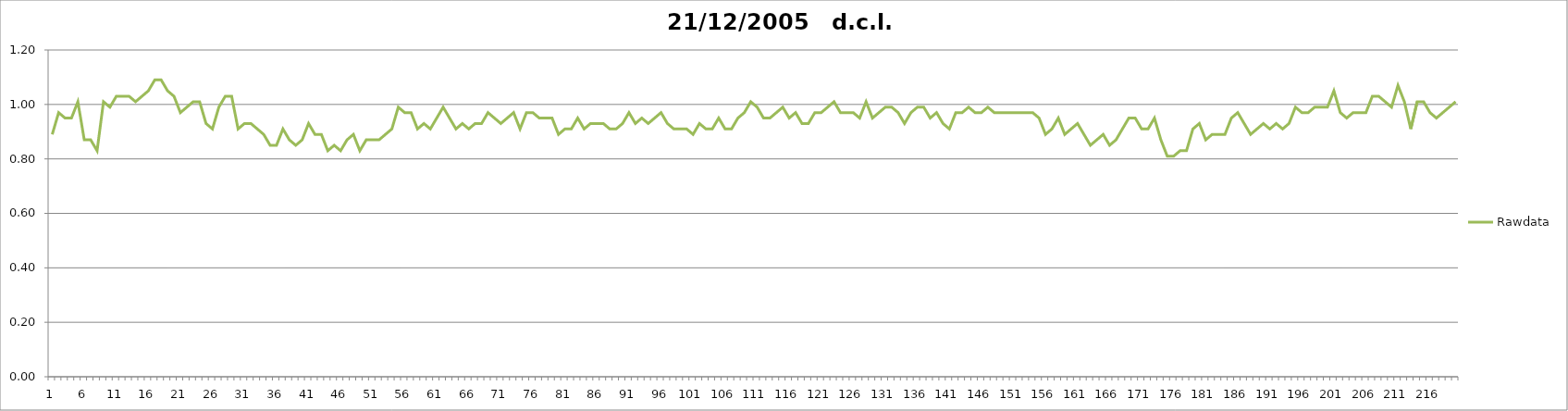
| Category | Rawdata |
|---|---|
| 0 | 0.89 |
| 1 | 0.97 |
| 2 | 0.95 |
| 3 | 0.95 |
| 4 | 1.01 |
| 5 | 0.87 |
| 6 | 0.87 |
| 7 | 0.83 |
| 8 | 1.01 |
| 9 | 0.99 |
| 10 | 1.03 |
| 11 | 1.03 |
| 12 | 1.03 |
| 13 | 1.01 |
| 14 | 1.03 |
| 15 | 1.05 |
| 16 | 1.09 |
| 17 | 1.09 |
| 18 | 1.05 |
| 19 | 1.03 |
| 20 | 0.97 |
| 21 | 0.99 |
| 22 | 1.01 |
| 23 | 1.01 |
| 24 | 0.93 |
| 25 | 0.91 |
| 26 | 0.99 |
| 27 | 1.03 |
| 28 | 1.03 |
| 29 | 0.91 |
| 30 | 0.93 |
| 31 | 0.93 |
| 32 | 0.91 |
| 33 | 0.89 |
| 34 | 0.85 |
| 35 | 0.85 |
| 36 | 0.91 |
| 37 | 0.87 |
| 38 | 0.85 |
| 39 | 0.87 |
| 40 | 0.93 |
| 41 | 0.89 |
| 42 | 0.89 |
| 43 | 0.83 |
| 44 | 0.85 |
| 45 | 0.83 |
| 46 | 0.87 |
| 47 | 0.89 |
| 48 | 0.83 |
| 49 | 0.87 |
| 50 | 0.87 |
| 51 | 0.87 |
| 52 | 0.89 |
| 53 | 0.91 |
| 54 | 0.99 |
| 55 | 0.97 |
| 56 | 0.97 |
| 57 | 0.91 |
| 58 | 0.93 |
| 59 | 0.91 |
| 60 | 0.95 |
| 61 | 0.99 |
| 62 | 0.95 |
| 63 | 0.91 |
| 64 | 0.93 |
| 65 | 0.91 |
| 66 | 0.93 |
| 67 | 0.93 |
| 68 | 0.97 |
| 69 | 0.95 |
| 70 | 0.93 |
| 71 | 0.95 |
| 72 | 0.97 |
| 73 | 0.91 |
| 74 | 0.97 |
| 75 | 0.97 |
| 76 | 0.95 |
| 77 | 0.95 |
| 78 | 0.95 |
| 79 | 0.89 |
| 80 | 0.91 |
| 81 | 0.91 |
| 82 | 0.95 |
| 83 | 0.91 |
| 84 | 0.93 |
| 85 | 0.93 |
| 86 | 0.93 |
| 87 | 0.91 |
| 88 | 0.91 |
| 89 | 0.93 |
| 90 | 0.97 |
| 91 | 0.93 |
| 92 | 0.95 |
| 93 | 0.93 |
| 94 | 0.95 |
| 95 | 0.97 |
| 96 | 0.93 |
| 97 | 0.91 |
| 98 | 0.91 |
| 99 | 0.91 |
| 100 | 0.89 |
| 101 | 0.93 |
| 102 | 0.91 |
| 103 | 0.91 |
| 104 | 0.95 |
| 105 | 0.91 |
| 106 | 0.91 |
| 107 | 0.95 |
| 108 | 0.97 |
| 109 | 1.01 |
| 110 | 0.99 |
| 111 | 0.95 |
| 112 | 0.95 |
| 113 | 0.97 |
| 114 | 0.99 |
| 115 | 0.95 |
| 116 | 0.97 |
| 117 | 0.93 |
| 118 | 0.93 |
| 119 | 0.97 |
| 120 | 0.97 |
| 121 | 0.99 |
| 122 | 1.01 |
| 123 | 0.97 |
| 124 | 0.97 |
| 125 | 0.97 |
| 126 | 0.95 |
| 127 | 1.01 |
| 128 | 0.95 |
| 129 | 0.97 |
| 130 | 0.99 |
| 131 | 0.99 |
| 132 | 0.97 |
| 133 | 0.93 |
| 134 | 0.97 |
| 135 | 0.99 |
| 136 | 0.99 |
| 137 | 0.95 |
| 138 | 0.97 |
| 139 | 0.93 |
| 140 | 0.91 |
| 141 | 0.97 |
| 142 | 0.97 |
| 143 | 0.99 |
| 144 | 0.97 |
| 145 | 0.97 |
| 146 | 0.99 |
| 147 | 0.97 |
| 148 | 0.97 |
| 149 | 0.97 |
| 150 | 0.97 |
| 151 | 0.97 |
| 152 | 0.97 |
| 153 | 0.97 |
| 154 | 0.95 |
| 155 | 0.89 |
| 156 | 0.91 |
| 157 | 0.95 |
| 158 | 0.89 |
| 159 | 0.91 |
| 160 | 0.93 |
| 161 | 0.89 |
| 162 | 0.85 |
| 163 | 0.87 |
| 164 | 0.89 |
| 165 | 0.85 |
| 166 | 0.87 |
| 167 | 0.91 |
| 168 | 0.95 |
| 169 | 0.95 |
| 170 | 0.91 |
| 171 | 0.91 |
| 172 | 0.95 |
| 173 | 0.87 |
| 174 | 0.81 |
| 175 | 0.81 |
| 176 | 0.83 |
| 177 | 0.83 |
| 178 | 0.91 |
| 179 | 0.93 |
| 180 | 0.87 |
| 181 | 0.89 |
| 182 | 0.89 |
| 183 | 0.89 |
| 184 | 0.95 |
| 185 | 0.97 |
| 186 | 0.93 |
| 187 | 0.89 |
| 188 | 0.91 |
| 189 | 0.93 |
| 190 | 0.91 |
| 191 | 0.93 |
| 192 | 0.91 |
| 193 | 0.93 |
| 194 | 0.99 |
| 195 | 0.97 |
| 196 | 0.97 |
| 197 | 0.99 |
| 198 | 0.99 |
| 199 | 0.99 |
| 200 | 1.05 |
| 201 | 0.97 |
| 202 | 0.95 |
| 203 | 0.97 |
| 204 | 0.97 |
| 205 | 0.97 |
| 206 | 1.03 |
| 207 | 1.03 |
| 208 | 1.01 |
| 209 | 0.99 |
| 210 | 1.07 |
| 211 | 1.01 |
| 212 | 0.91 |
| 213 | 1.01 |
| 214 | 1.01 |
| 215 | 0.97 |
| 216 | 0.95 |
| 217 | 0.97 |
| 218 | 0.99 |
| 219 | 1.01 |